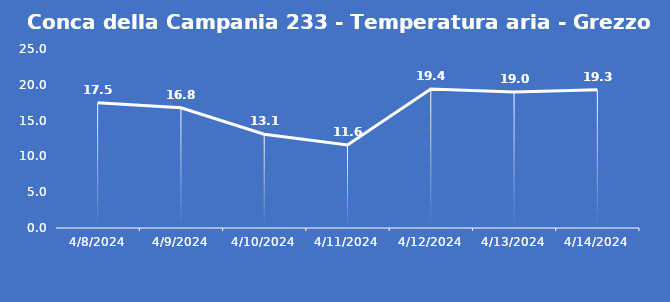
| Category | Conca della Campania 233 - Temperatura aria - Grezzo (°C) |
|---|---|
| 4/8/24 | 17.5 |
| 4/9/24 | 16.8 |
| 4/10/24 | 13.1 |
| 4/11/24 | 11.6 |
| 4/12/24 | 19.4 |
| 4/13/24 | 19 |
| 4/14/24 | 19.3 |